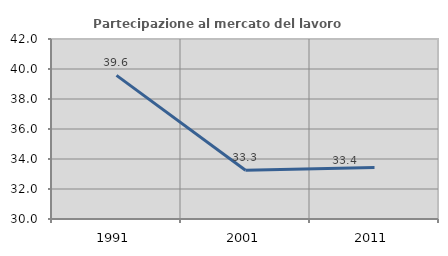
| Category | Partecipazione al mercato del lavoro  femminile |
|---|---|
| 1991.0 | 39.574 |
| 2001.0 | 33.251 |
| 2011.0 | 33.426 |